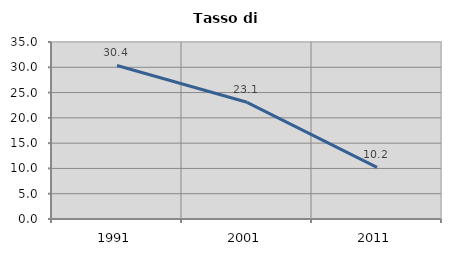
| Category | Tasso di disoccupazione   |
|---|---|
| 1991.0 | 30.357 |
| 2001.0 | 23.077 |
| 2011.0 | 10.204 |